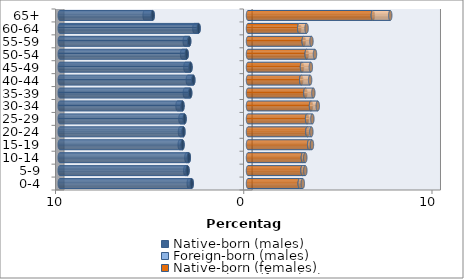
| Category | Native-born (males) | Foreign-born (males) | Native-born (females) | Foreign-born (females) |
|---|---|---|---|---|
| 0-4 | -2.99 | -0.157 | 2.748 | 0.163 |
| 5-9 | -3.213 | -0.12 | 2.896 | 0.149 |
| 10-14 | -3.144 | -0.128 | 2.917 | 0.127 |
| 15-19 | -3.479 | -0.149 | 3.248 | 0.149 |
| 20-24 | -3.431 | -0.182 | 3.153 | 0.212 |
| 25-29 | -3.371 | -0.219 | 3.139 | 0.281 |
| 30-34 | -3.481 | -0.263 | 3.347 | 0.359 |
| 35-39 | -3.071 | -0.283 | 3.048 | 0.423 |
| 40-44 | -2.906 | -0.29 | 2.827 | 0.472 |
| 45-49 | -3.055 | -0.27 | 2.869 | 0.469 |
| 50-54 | -3.259 | -0.241 | 3.118 | 0.44 |
| 55-59 | -3.125 | -0.237 | 2.959 | 0.411 |
| 60-64 | -2.625 | -0.225 | 2.722 | 0.39 |
| 65+ | -5.063 | -0.428 | 6.634 | 0.923 |